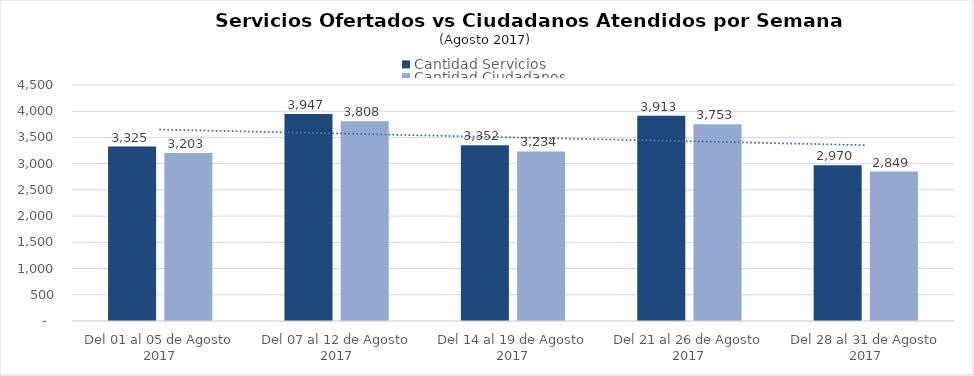
| Category | Cantidad Servicios | Cantidad Ciudadanos |
|---|---|---|
| Del 01 al 05 de Agosto 2017 | 3325 | 3203 |
| Del 07 al 12 de Agosto 2017 | 3947 | 3808 |
| Del 14 al 19 de Agosto 2017 | 3352 | 3234 |
| Del 21 al 26 de Agosto 2017 | 3913 | 3753 |
| Del 28 al 31 de Agosto 2017 | 2970 | 2849 |